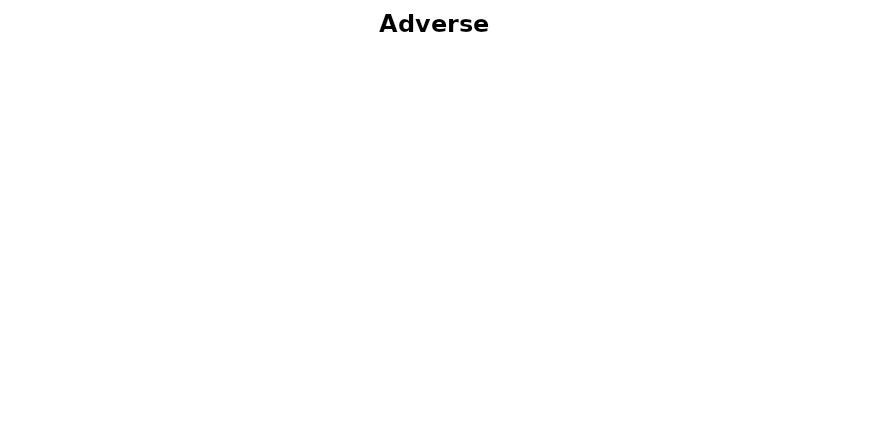
| Category | Series 0 |
|---|---|
| Haemorrhage (Intracranial/cerebral haemorrhage) (up to 1 week post-op, 1 year, 2 years) | 0 |
| Infection (up to 1 week post-op, 1 year, 2 years) | 0 |
| Skin erosion (up to 1 week post-op, 1 year, 2 years) | 0 |
| Status epilepticus (up to 1 week post-op, 1 year, 2 years) | 0 |
| Memory impairment (up to 1 week post-op, 1 year, 2 years) | 0 |
| Psychiatric disturbance (up to 1 week post-op, 1 year, 2 years) | 0 |
| Other adverse outcome | 0 |